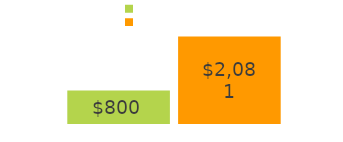
| Category | coming in | going out |
|---|---|---|
| money coming in: | 800 | 2081 |